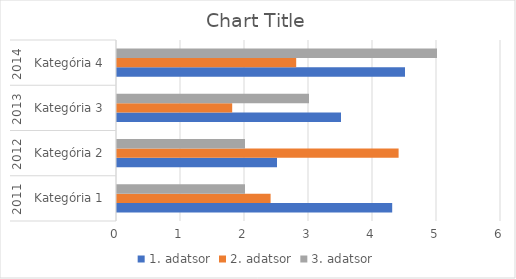
| Category | 1. adatsor | 2. adatsor | 3. adatsor |
|---|---|---|---|
| 0 | 4.3 | 2.4 | 2 |
| 1 | 2.5 | 4.4 | 2 |
| 2 | 3.5 | 1.8 | 3 |
| 3 | 4.5 | 2.8 | 5 |